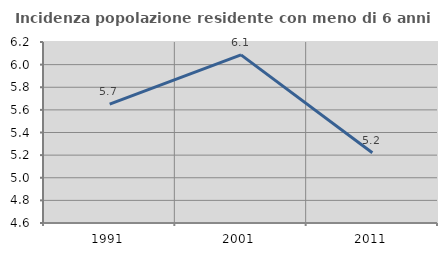
| Category | Incidenza popolazione residente con meno di 6 anni |
|---|---|
| 1991.0 | 5.652 |
| 2001.0 | 6.086 |
| 2011.0 | 5.22 |